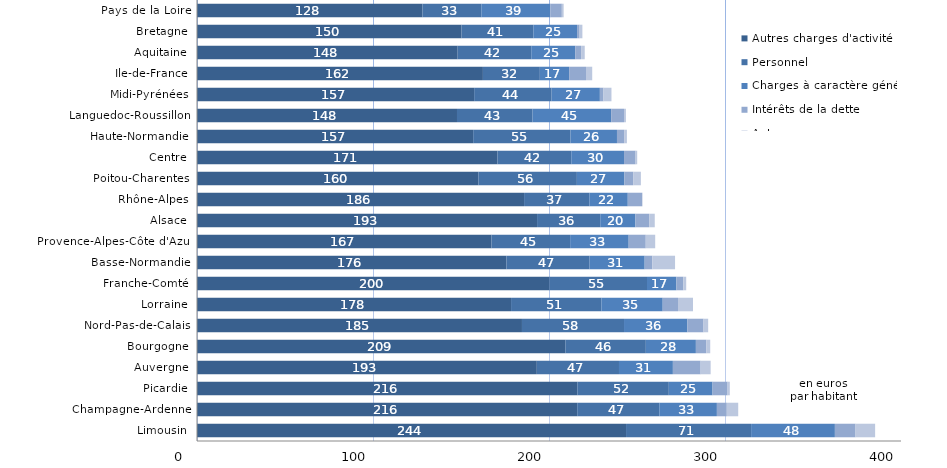
| Category | Autres charges d'activité | Personnel | Charges à caractère général | Intérêts de la dette | Autres |
|---|---|---|---|---|---|
| Limousin | 243.778 | 71.056 | 47.606 | 11.741 | 11.12 |
| Champagne-Ardenne | 216.034 | 46.649 | 32.713 | 5.626 | 6.486 |
| Picardie | 216.099 | 51.976 | 24.844 | 8.549 | 1.261 |
| Auvergne | 193.08 | 46.687 | 30.625 | 15.759 | 5.69 |
| Bourgogne | 209.28 | 45.747 | 28.433 | 5.867 | 2.277 |
| Nord-Pas-de-Calais | 184.64 | 57.984 | 36.005 | 9.171 | 2.642 |
| Lorraine | 178.446 | 51.307 | 34.856 | 8.695 | 8.531 |
| Franche-Comté | 200.373 | 55.31 | 16.666 | 3.959 | 1.648 |
| Basse-Normandie | 175.796 | 47.274 | 31.291 | 4.378 | 12.88 |
| Provence-Alpes-Côte d'Azur | 167.302 | 44.708 | 33.269 | 9.696 | 5.363 |
| Alsace | 193.22 | 35.898 | 19.981 | 7.816 | 3.176 |
| Rhône-Alpes | 185.842 | 37.063 | 21.861 | 8.169 | 0.195 |
| Poitou-Charentes | 159.873 | 55.973 | 26.944 | 5.034 | 4.383 |
| Centre | 170.712 | 41.939 | 29.978 | 6.555 | 0.929 |
| Haute-Normandie | 156.916 | 55.27 | 26.435 | 4.069 | 1.575 |
| Languedoc-Roussillon | 147.724 | 42.941 | 44.666 | 7.302 | 1.066 |
| Midi-Pyrénées | 157.471 | 44.017 | 27.419 | 2.049 | 4.534 |
| Ile-de-France | 162.452 | 32.352 | 16.632 | 9.588 | 3.531 |
| Aquitaine | 148.102 | 41.809 | 24.994 | 3.341 | 2.062 |
| Bretagne | 150.3 | 40.802 | 24.842 | 1.454 | 1.573 |
| Pays de la Loire | 128.077 | 33.458 | 39.192 | 6.564 | 1.023 |